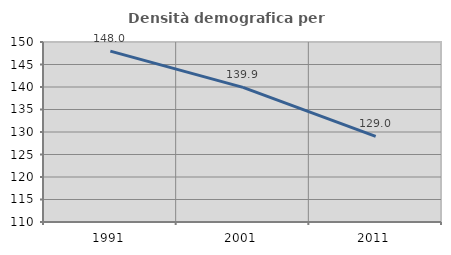
| Category | Densità demografica |
|---|---|
| 1991.0 | 147.968 |
| 2001.0 | 139.928 |
| 2011.0 | 129.045 |